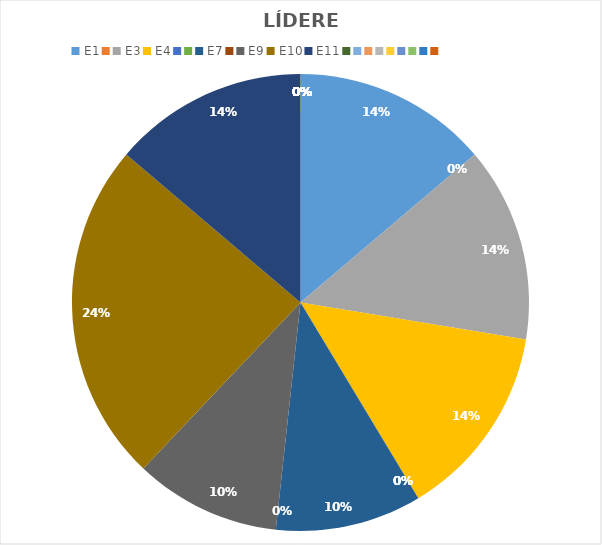
| Category | Series 0 |
|---|---|
| E1 | 4 |
|  | 0 |
| E3 | 4 |
| E4 | 4 |
|  | 0 |
|  | 0 |
| E7 | 3 |
|  | 0 |
| E9 | 3 |
| E10 | 7 |
| E11 | 4 |